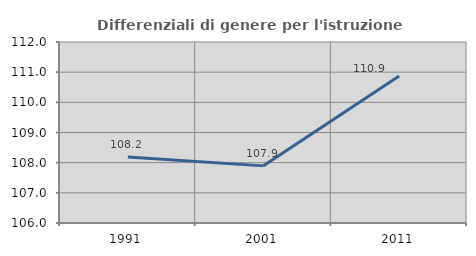
| Category | Differenziali di genere per l'istruzione superiore |
|---|---|
| 1991.0 | 108.185 |
| 2001.0 | 107.894 |
| 2011.0 | 110.876 |